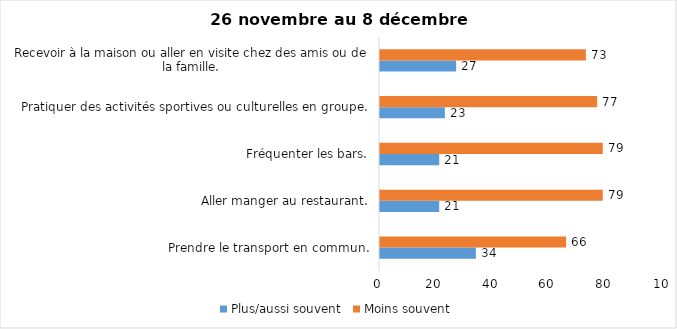
| Category | Plus/aussi souvent | Moins souvent |
|---|---|---|
| Prendre le transport en commun. | 34 | 66 |
| Aller manger au restaurant. | 21 | 79 |
| Fréquenter les bars. | 21 | 79 |
| Pratiquer des activités sportives ou culturelles en groupe. | 23 | 77 |
| Recevoir à la maison ou aller en visite chez des amis ou de la famille. | 27 | 73 |